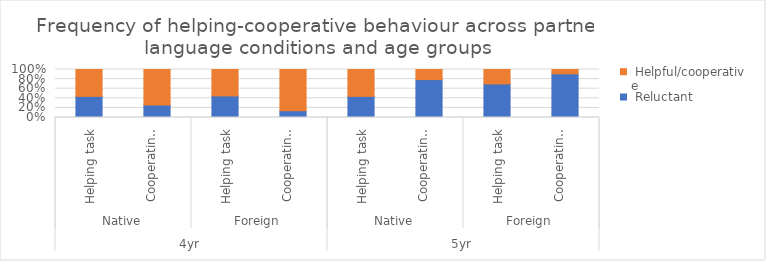
| Category | Series 0 | Series 1 |
|---|---|---|
| 0 | 44 | 56 |
| 1 | 26 | 74 |
| 2 | 45 | 55 |
| 3 | 14 | 86 |
| 4 | 44 | 56 |
| 5 | 79 | 21 |
| 6 | 70 | 30 |
| 7 | 91 | 9 |